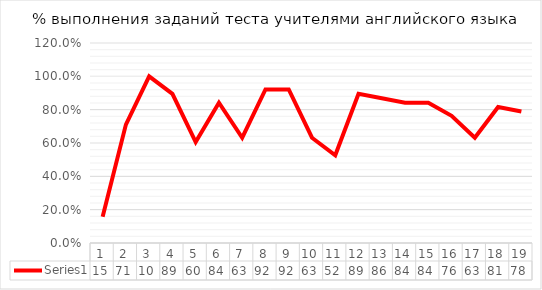
| Category | Series 0 |
|---|---|
| 0 | 0.158 |
| 1 | 0.711 |
| 2 | 1 |
| 3 | 0.895 |
| 4 | 0.605 |
| 5 | 0.842 |
| 6 | 0.632 |
| 7 | 0.921 |
| 8 | 0.921 |
| 9 | 0.632 |
| 10 | 0.526 |
| 11 | 0.895 |
| 12 | 0.868 |
| 13 | 0.842 |
| 14 | 0.842 |
| 15 | 0.763 |
| 16 | 0.632 |
| 17 | 0.816 |
| 18 | 0.789 |